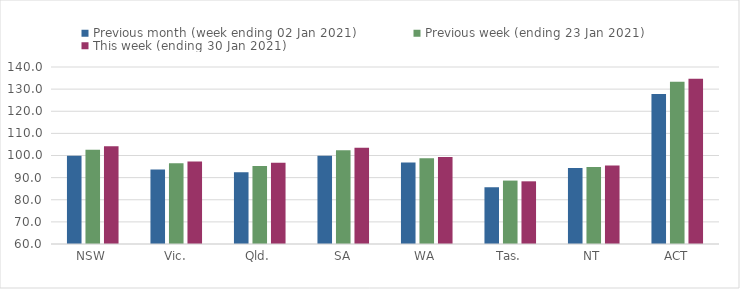
| Category | Previous month (week ending 02 Jan 2021) | Previous week (ending 23 Jan 2021) | This week (ending 30 Jan 2021) |
|---|---|---|---|
| NSW | 99.85 | 102.64 | 104.2 |
| Vic. | 93.72 | 96.54 | 97.27 |
| Qld. | 92.44 | 95.3 | 96.71 |
| SA | 99.89 | 102.36 | 103.45 |
| WA | 96.88 | 98.76 | 99.32 |
| Tas. | 85.65 | 88.66 | 88.33 |
| NT | 94.34 | 94.77 | 95.5 |
| ACT | 127.78 | 133.33 | 134.67 |